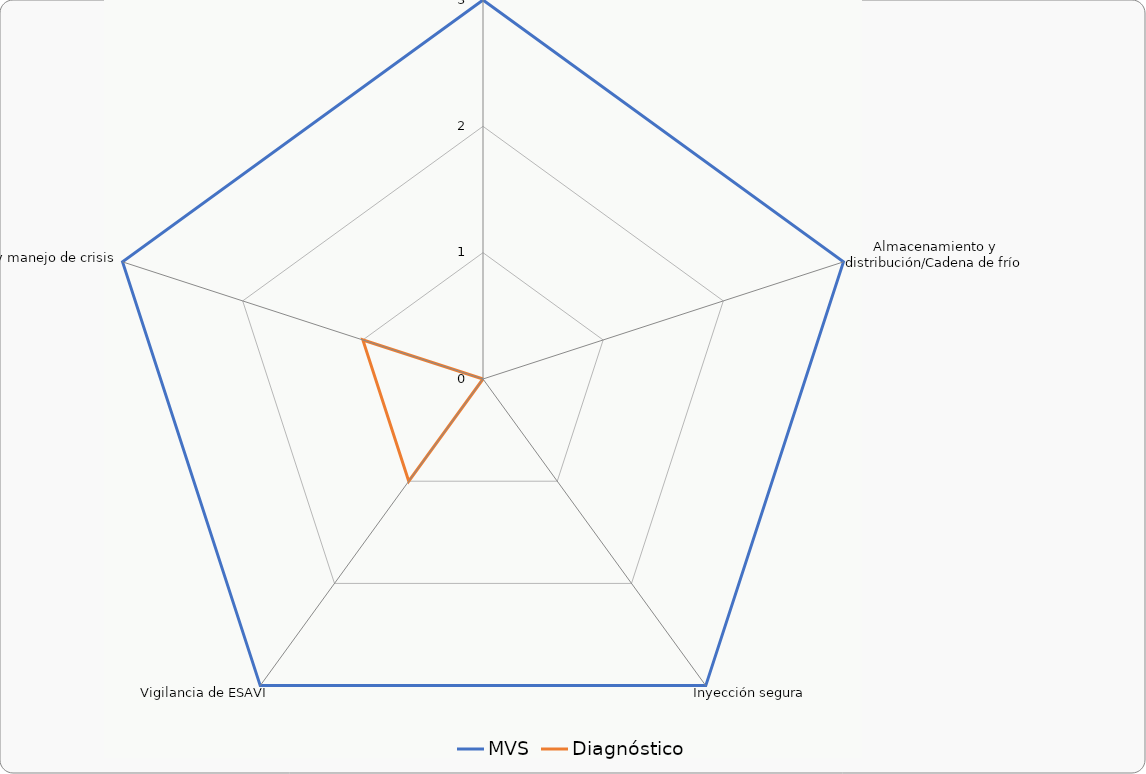
| Category | MVS | Diagnóstico |
|---|---|---|
| Vacunas de calidad | 3 | 0 |
| Almacenamiento y distribución/Cadena de frío | 3 | 0 |
| Inyección segura | 3 | 0 |
| Vigilancia de ESAVI | 3 | 1 |
| Prevención y manejo de crisis | 3 | 1 |